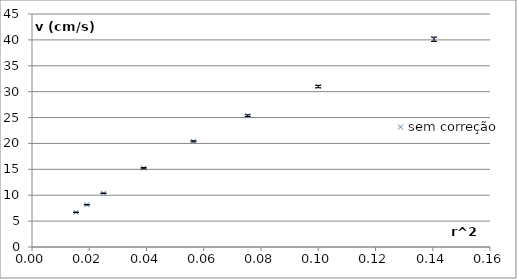
| Category | sem correção |
|---|---|
| 0.015375999999999999 | 6.687 |
| 0.019182250000000005 | 8.164 |
| 0.02496400000000001 | 10.375 |
| 0.039006250000000006 | 15.228 |
| 0.056406250000000005 | 20.408 |
| 0.07535025000000001 | 25.366 |
| 0.09998244000000002 | 30.993 |
| 0.14043756250000003 | 40.123 |